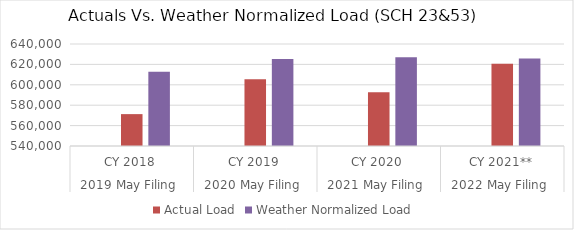
| Category | Residential: SCH 23&53 | Actual Load | Weather Normalized Load  |
|---|---|---|---|
| 0 |  | 571255.383 | 612842.741 |
| 1 |  | 605469.876 | 625294.797 |
| 2 |  | 592801.485 | 626901.49 |
| 3 |  | 620732.957 | 625698.563 |